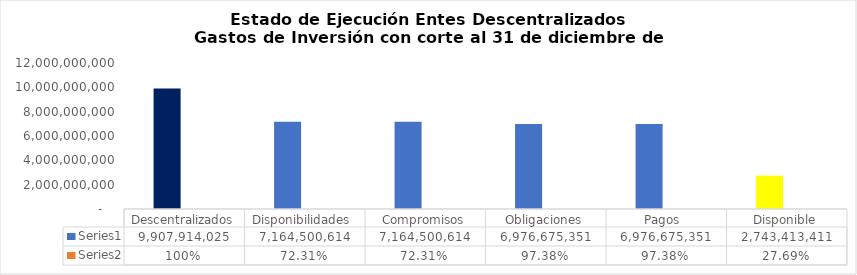
| Category | Series 0 | Series 1 |
|---|---|---|
| Descentralizados | 9907914024.97 | 1 |
| Disponibilidades  | 7164500614.194 | 0.723 |
| Compromisos | 7164500614.194 | 0.723 |
| Obligaciones | 6976675351.263 | 0.974 |
| Pagos  | 6976675351.263 | 0.974 |
|  Disponible  | 2743413410.776 | 0.277 |